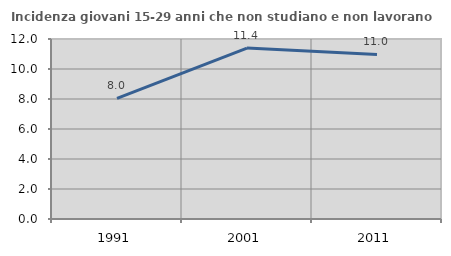
| Category | Incidenza giovani 15-29 anni che non studiano e non lavorano  |
|---|---|
| 1991.0 | 8.036 |
| 2001.0 | 11.397 |
| 2011.0 | 10.971 |